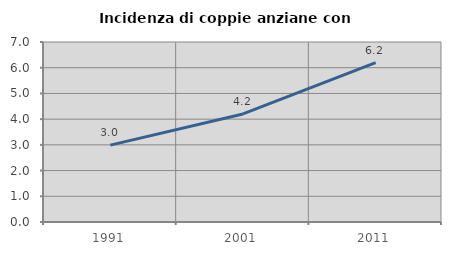
| Category | Incidenza di coppie anziane con figli |
|---|---|
| 1991.0 | 2.99 |
| 2001.0 | 4.202 |
| 2011.0 | 6.195 |